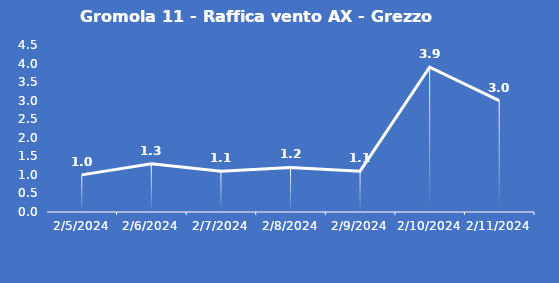
| Category | Gromola 11 - Raffica vento AX - Grezzo (m/s) |
|---|---|
| 2/5/24 | 1 |
| 2/6/24 | 1.3 |
| 2/7/24 | 1.1 |
| 2/8/24 | 1.2 |
| 2/9/24 | 1.1 |
| 2/10/24 | 3.9 |
| 2/11/24 | 3 |